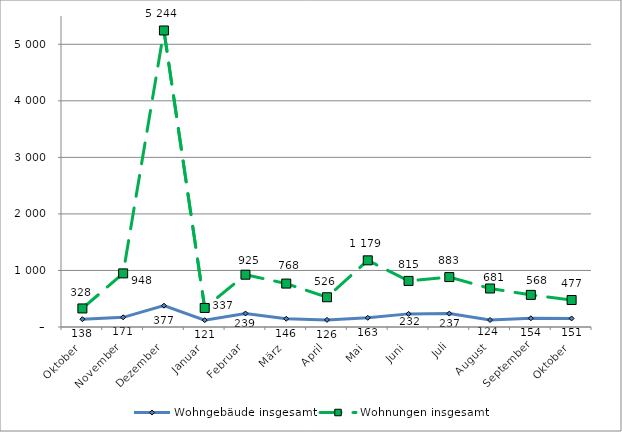
| Category | Wohngebäude insgesamt | Wohnungen insgesamt |
|---|---|---|
| Oktober | 138 | 328 |
| November | 171 | 948 |
| Dezember | 377 | 5244 |
| Januar | 121 | 337 |
| Februar | 239 | 925 |
| März | 146 | 768 |
| April | 126 | 526 |
| Mai | 163 | 1179 |
| Juni | 232 | 815 |
| Juli | 237 | 883 |
| August | 124 | 681 |
| September | 154 | 568 |
| Oktober | 151 | 477 |